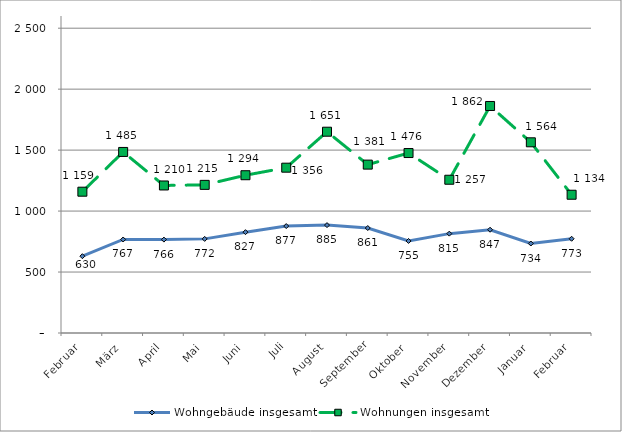
| Category | Wohngebäude insgesamt | Wohnungen insgesamt |
|---|---|---|
| Februar | 630 | 1159 |
| März | 767 | 1485 |
| April | 766 | 1210 |
| Mai | 772 | 1215 |
| Juni | 827 | 1294 |
| Juli | 877 | 1356 |
| August | 885 | 1651 |
| September | 861 | 1381 |
| Oktober | 755 | 1476 |
| November | 815 | 1257 |
| Dezember | 847 | 1862 |
| Januar | 734 | 1564 |
| Februar | 773 | 1134 |